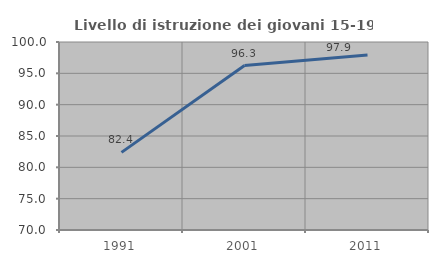
| Category | Livello di istruzione dei giovani 15-19 anni |
|---|---|
| 1991.0 | 82.39 |
| 2001.0 | 96.25 |
| 2011.0 | 97.938 |